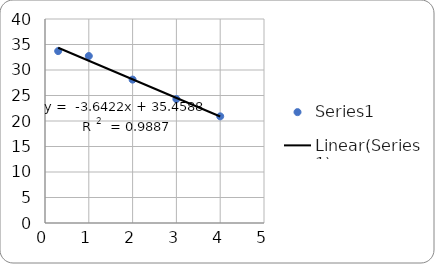
| Category | Series 0 |
|---|---|
| 4.0 | 20.912 |
| 3.0 | 24.3 |
| 2.0 | 28.115 |
| 1.0 | 32.74 |
| 0.3010299956639812 | 33.708 |